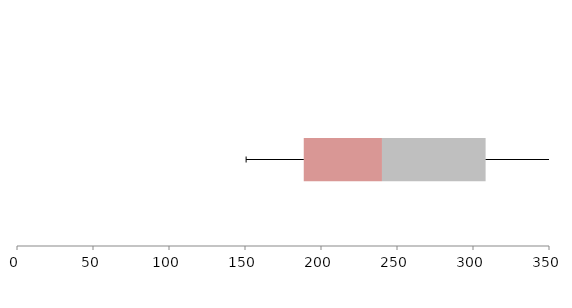
| Category | Series 1 | Series 2 | Series 3 |
|---|---|---|---|
| 0 | 188.656 | 51.453 | 68.189 |